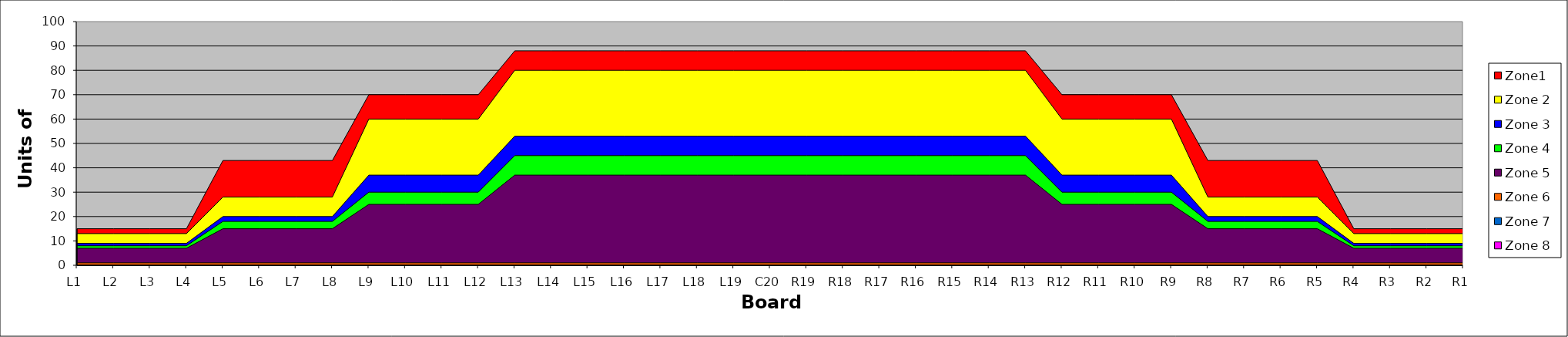
| Category | Zone1 | Zone 2 | Zone 3 | Zone 4 | Zone 5 | Zone 6 | Zone 7 | Zone 8 |
|---|---|---|---|---|---|---|---|---|
| L1 | 15 | 13 | 9 | 8 | 7 | 1 |  |  |
| L2 | 15 | 13 | 9 | 8 | 7 | 1 |  |  |
| L3 | 15 | 13 | 9 | 8 | 7 | 1 |  |  |
| L4 | 15 | 13 | 9 | 8 | 7 | 1 |  |  |
| L5 | 43 | 28 | 20 | 18 | 15 | 1 |  |  |
| L6 | 43 | 28 | 20 | 18 | 15 | 1 |  |  |
| L7 | 43 | 28 | 20 | 18 | 15 | 1 |  |  |
| L8 | 43 | 28 | 20 | 18 | 15 | 1 |  |  |
| L9 | 70 | 60 | 37 | 30 | 25 | 1 |  |  |
| L10 | 70 | 60 | 37 | 30 | 25 | 1 |  |  |
| L11 | 70 | 60 | 37 | 30 | 25 | 1 |  |  |
| L12 | 70 | 60 | 37 | 30 | 25 | 1 |  |  |
| L13 | 88 | 80 | 53 | 45 | 37 | 1 |  |  |
| L14 | 88 | 80 | 53 | 45 | 37 | 1 |  |  |
| L15 | 88 | 80 | 53 | 45 | 37 | 1 |  |  |
| L16 | 88 | 80 | 53 | 45 | 37 | 1 |  |  |
| L17 | 88 | 80 | 53 | 45 | 37 | 1 |  |  |
| L18 | 88 | 80 | 53 | 45 | 37 | 1 |  |  |
| L19 | 88 | 80 | 53 | 45 | 37 | 1 |  |  |
| C20 | 88 | 80 | 53 | 45 | 37 | 1 |  |  |
| R19 | 88 | 80 | 53 | 45 | 37 | 1 |  |  |
| R18 | 88 | 80 | 53 | 45 | 37 | 1 |  |  |
| R17 | 88 | 80 | 53 | 45 | 37 | 1 |  |  |
| R16 | 88 | 80 | 53 | 45 | 37 | 1 |  |  |
| R15 | 88 | 80 | 53 | 45 | 37 | 1 |  |  |
| R14 | 88 | 80 | 53 | 45 | 37 | 1 |  |  |
| R13 | 88 | 80 | 53 | 45 | 37 | 1 |  |  |
| R12 | 70 | 60 | 37 | 30 | 25 | 1 |  |  |
| R11 | 70 | 60 | 37 | 30 | 25 | 1 |  |  |
| R10 | 70 | 60 | 37 | 30 | 25 | 1 |  |  |
| R9 | 70 | 60 | 37 | 30 | 25 | 1 |  |  |
| R8 | 43 | 28 | 20 | 18 | 15 | 1 |  |  |
| R7 | 43 | 28 | 20 | 18 | 15 | 1 |  |  |
| R6 | 43 | 28 | 20 | 18 | 15 | 1 |  |  |
| R5 | 43 | 28 | 20 | 18 | 15 | 1 |  |  |
| R4 | 15 | 13 | 9 | 8 | 7 | 1 |  |  |
| R3 | 15 | 13 | 9 | 8 | 7 | 1 |  |  |
| R2 | 15 | 13 | 9 | 8 | 7 | 1 |  |  |
| R1 | 15 | 13 | 9 | 8 | 7 | 1 |  |  |